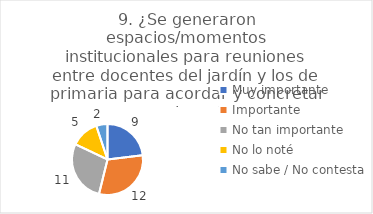
| Category | 9. ¿Se generaron espacios/momentos institucionales para reuniones entre docentes del jardín y los de primaria para acordar y concretar acciones? |
|---|---|
| Muy importante  | 0.231 |
| Importante  | 0.308 |
| No tan importante  | 0.282 |
| No lo noté  | 0.128 |
| No sabe / No contesta | 0.051 |